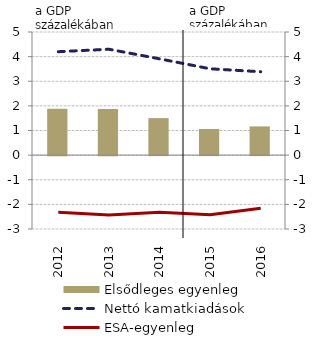
| Category | Elsődleges egyenleg |
|---|---|
| 2012.0 | 1.879 |
| 2013.0 | 1.873 |
| 2014.0 | 1.502 |
| 2015.0 | 1.06 |
| 2016.0 | 1.166 |